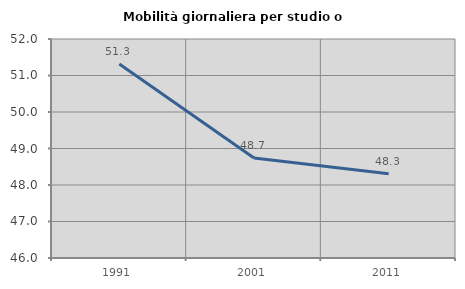
| Category | Mobilità giornaliera per studio o lavoro |
|---|---|
| 1991.0 | 51.314 |
| 2001.0 | 48.74 |
| 2011.0 | 48.309 |